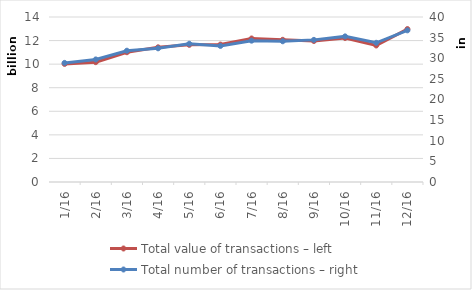
| Category | Total value of transactions – left |
|---|---|
| 2016-01-01 | 10020065485 |
| 2016-02-01 | 10168209677 |
| 2016-03-01 | 11012768983 |
| 2016-04-01 | 11427511865 |
| 2016-05-01 | 11640445099 |
| 2016-06-01 | 11659431221 |
| 2016-07-01 | 12176248600 |
| 2016-08-01 | 12063729254 |
| 2016-09-01 | 11964839633 |
| 2016-10-01 | 12219918379 |
| 2016-11-01 | 11583597152 |
| 2016-12-01 | 12975531383 |